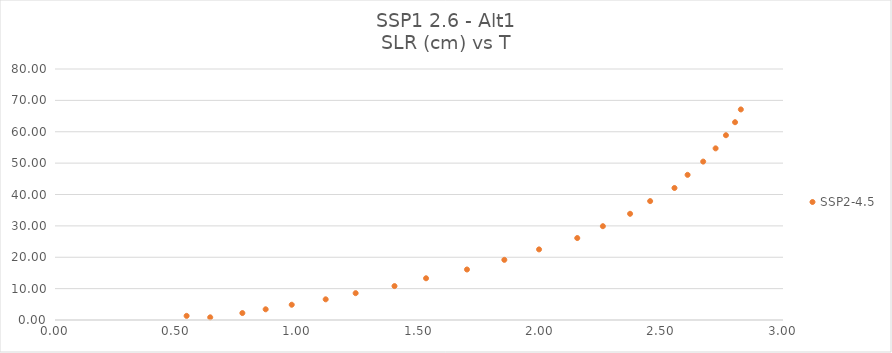
| Category | SSP2-4.5 |
|---|---|
| 0.639593181 | 0.851 |
| 0.542364652 | 1.315 |
| 0.772130534 | 2.215 |
| 0.868150926 | 3.412 |
| 0.975561417 | 4.865 |
| 1.115501613 | 6.592 |
| 1.238923475 | 8.555 |
| 1.399075338 | 10.811 |
| 1.529084554 | 13.3 |
| 1.697706221 | 16.096 |
| 1.851663574 | 19.173 |
| 1.994722691 | 22.503 |
| 2.152171025 | 26.12 |
| 2.257771515 | 29.9 |
| 2.369841711 | 33.851 |
| 2.452557005 | 37.897 |
| 2.552801809 | 42.074 |
| 2.606847005 | 46.264 |
| 2.671087201 | 50.486 |
| 2.722305926 | 54.704 |
| 2.76488024 | 58.895 |
| 2.802406907 | 63.042 |
| 2.826282005 | 67.113 |